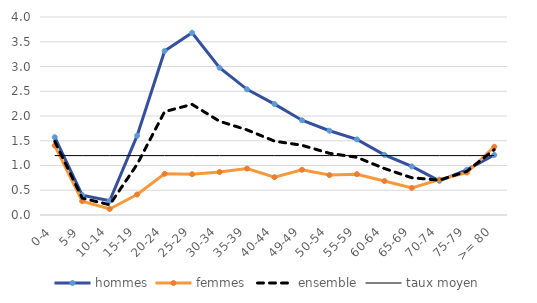
| Category | hommes | femmes  | ensemble | taux moyen  |
|---|---|---|---|---|
| 0-4 | 1.571 | 1.403 | 1.489 | 1.2 |
| 5-9 | 0.401 | 0.279 | 0.342 | 1.2 |
| 10-14 | 0.287 | 0.122 | 0.206 | 1.2 |
| 15-19 | 1.602 | 0.414 | 1.024 | 1.2 |
| 20-24 | 3.313 | 0.833 | 2.088 | 1.2 |
| 25-29 | 3.681 | 0.825 | 2.235 | 1.2 |
| 30-34 | 2.975 | 0.868 | 1.893 | 1.2 |
| 35-39 | 2.539 | 0.938 | 1.72 | 1.2 |
| 40-44 | 2.241 | 0.764 | 1.492 | 1.2 |
| 49-49 | 1.914 | 0.914 | 1.408 | 1.2 |
| 50-54 | 1.703 | 0.806 | 1.246 | 1.2 |
| 55-59 | 1.527 | 0.825 | 1.166 | 1.2 |
| 60-64 | 1.215 | 0.687 | 0.939 | 1.2 |
| 65-69 | 0.982 | 0.547 | 0.752 | 1.2 |
| 70-74 | 0.691 | 0.715 | 0.704 | 1.2 |
| 75-79 | 0.912 | 0.858 | 0.882 | 1.2 |
| >= 80 | 1.213 | 1.379 | 1.32 | 1.2 |